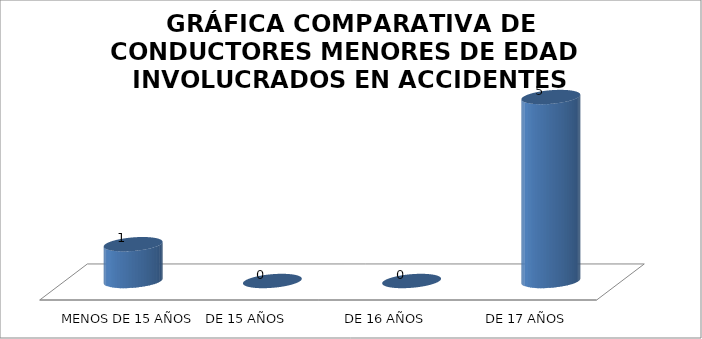
| Category | Series 0 |
|---|---|
| MENOS DE 15 AÑOS | 1 |
| DE 15 AÑOS | 0 |
| DE 16 AÑOS | 0 |
|  DE 17 AÑOS | 5 |